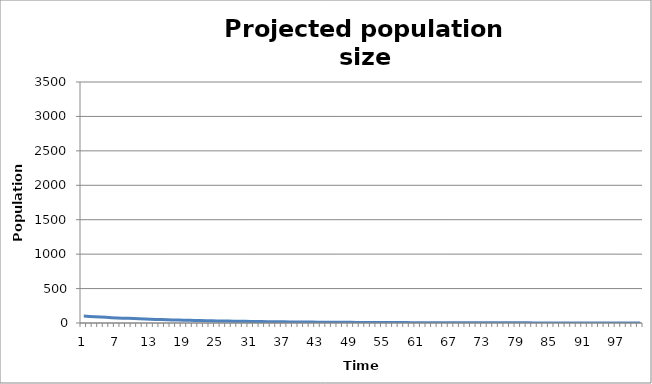
| Category | Series 0 |
|---|---|
| 0 | 100 |
| 1 | 95.158 |
| 2 | 90.551 |
| 3 | 86.166 |
| 4 | 81.994 |
| 5 | 78.024 |
| 6 | 74.247 |
| 7 | 70.652 |
| 8 | 67.231 |
| 9 | 63.976 |
| 10 | 60.878 |
| 11 | 57.93 |
| 12 | 55.126 |
| 13 | 52.456 |
| 14 | 49.917 |
| 15 | 47.5 |
| 16 | 45.2 |
| 17 | 43.011 |
| 18 | 40.929 |
| 19 | 38.947 |
| 20 | 37.061 |
| 21 | 35.267 |
| 22 | 33.559 |
| 23 | 31.935 |
| 24 | 30.388 |
| 25 | 28.917 |
| 26 | 27.517 |
| 27 | 26.185 |
| 28 | 24.917 |
| 29 | 23.71 |
| 30 | 22.562 |
| 31 | 21.47 |
| 32 | 20.43 |
| 33 | 19.441 |
| 34 | 18.5 |
| 35 | 17.604 |
| 36 | 16.752 |
| 37 | 15.941 |
| 38 | 15.169 |
| 39 | 14.434 |
| 40 | 13.735 |
| 41 | 13.07 |
| 42 | 12.438 |
| 43 | 11.835 |
| 44 | 11.262 |
| 45 | 10.717 |
| 46 | 10.198 |
| 47 | 9.704 |
| 48 | 9.234 |
| 49 | 8.787 |
| 50 | 8.362 |
| 51 | 7.957 |
| 52 | 7.572 |
| 53 | 7.205 |
| 54 | 6.856 |
| 55 | 6.524 |
| 56 | 6.208 |
| 57 | 5.908 |
| 58 | 5.622 |
| 59 | 5.35 |
| 60 | 5.091 |
| 61 | 4.844 |
| 62 | 4.61 |
| 63 | 4.386 |
| 64 | 4.174 |
| 65 | 3.972 |
| 66 | 3.78 |
| 67 | 3.597 |
| 68 | 3.422 |
| 69 | 3.257 |
| 70 | 3.099 |
| 71 | 2.949 |
| 72 | 2.806 |
| 73 | 2.67 |
| 74 | 2.541 |
| 75 | 2.418 |
| 76 | 2.301 |
| 77 | 2.19 |
| 78 | 2.084 |
| 79 | 1.983 |
| 80 | 1.887 |
| 81 | 1.795 |
| 82 | 1.708 |
| 83 | 1.626 |
| 84 | 1.547 |
| 85 | 1.472 |
| 86 | 1.401 |
| 87 | 1.333 |
| 88 | 1.268 |
| 89 | 1.207 |
| 90 | 1.149 |
| 91 | 1.093 |
| 92 | 1.04 |
| 93 | 0.99 |
| 94 | 0.942 |
| 95 | 0.896 |
| 96 | 0.853 |
| 97 | 0.811 |
| 98 | 0.772 |
| 99 | 0.735 |
| 100 | 0.699 |